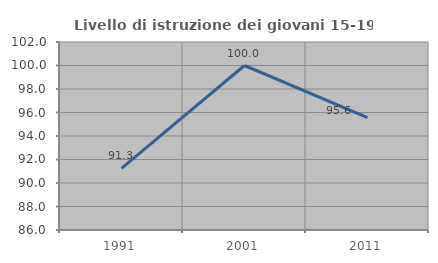
| Category | Livello di istruzione dei giovani 15-19 anni |
|---|---|
| 1991.0 | 91.25 |
| 2001.0 | 100 |
| 2011.0 | 95.556 |